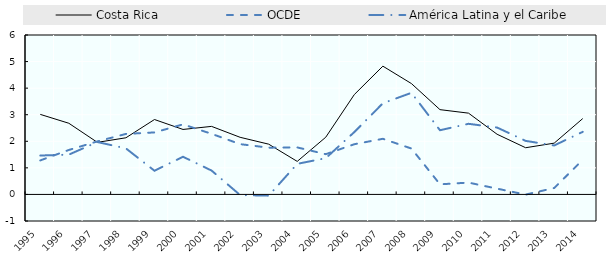
| Category | Costa Rica | OCDE | América Latina y el Caribe |
|---|---|---|---|
| 1995.0 | 3.013 | 1.28 | 1.464 |
| 1996.0 | 2.679 | 1.673 | 1.498 |
| 1997.0 | 1.96 | 1.996 | 1.972 |
| 1998.0 | 2.132 | 2.277 | 1.732 |
| 1999.0 | 2.819 | 2.333 | 0.892 |
| 2000.0 | 2.446 | 2.637 | 1.417 |
| 2001.0 | 2.561 | 2.281 | 0.898 |
| 2002.0 | 2.15 | 1.892 | -0.024 |
| 2003.0 | 1.892 | 1.76 | -0.046 |
| 2004.0 | 1.243 | 1.769 | 1.15 |
| 2005.0 | 2.154 | 1.515 | 1.365 |
| 2006.0 | 3.759 | 1.889 | 2.347 |
| 2007.0 | 4.827 | 2.093 | 3.431 |
| 2008.0 | 4.172 | 1.727 | 3.824 |
| 2009.0 | 3.191 | 0.38 | 2.416 |
| 2010.0 | 3.059 | 0.445 | 2.658 |
| 2011.0 | 2.265 | 0.218 | 2.518 |
| 2012.0 | 1.758 | -0.006 | 2.016 |
| 2013.0 | 1.93 | 0.242 | 1.842 |
| 2014.0 | 2.854 | 1.299 | 2.355 |